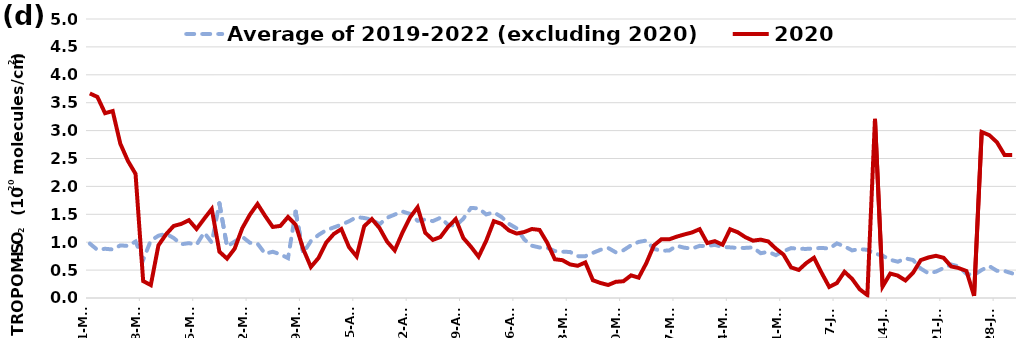
| Category | Average of 2019-2022 (excluding 2020) | 2020 |
|---|---|---|
| 2000-03-01 | 0.975 | 3.666 |
| 2000-03-02 | 0.863 | 3.603 |
| 2000-03-03 | 0.882 | 3.312 |
| 2000-03-04 | 0.87 | 3.35 |
| 2000-03-05 | 0.943 | 2.766 |
| 2000-03-06 | 0.933 | 2.456 |
| 2000-03-07 | 1.012 | 2.224 |
| 2000-03-08 | 0.683 | 0.303 |
| 2000-03-09 | 1.03 | 0.231 |
| 2000-03-10 | 1.116 | 0.943 |
| 2000-03-11 | 1.151 | 1.141 |
| 2000-03-12 | 1.075 | 1.291 |
| 2000-03-13 | 0.963 | 1.328 |
| 2000-03-14 | 0.983 | 1.395 |
| 2000-03-15 | 0.955 | 1.237 |
| 2000-03-16 | 1.172 | 1.42 |
| 2000-03-17 | 0.994 | 1.595 |
| 2000-03-18 | 1.696 | 0.83 |
| 2000-03-19 | 0.924 | 0.706 |
| 2000-03-20 | 1.011 | 0.884 |
| 2000-03-21 | 1.098 | 1.25 |
| 2000-03-22 | 0.99 | 1.493 |
| 2000-03-23 | 0.974 | 1.685 |
| 2000-03-24 | 0.793 | 1.471 |
| 2000-03-25 | 0.829 | 1.273 |
| 2000-03-26 | 0.782 | 1.292 |
| 2000-03-27 | 0.714 | 1.452 |
| 2000-03-28 | 1.547 | 1.313 |
| 2000-03-29 | 0.807 | 0.876 |
| 2000-03-30 | 1.02 | 0.556 |
| 2000-03-31 | 1.13 | 0.717 |
| 2000-04-01 | 1.216 | 0.992 |
| 2000-04-02 | 1.264 | 1.146 |
| 2000-04-03 | 1.313 | 1.235 |
| 2000-04-04 | 1.375 | 0.912 |
| 2000-04-05 | 1.449 | 0.745 |
| 2000-04-06 | 1.434 | 1.287 |
| 2000-04-07 | 1.404 | 1.415 |
| 2000-04-08 | 1.32 | 1.255 |
| 2000-04-09 | 1.439 | 1.01 |
| 2000-04-10 | 1.495 | 0.853 |
| 2000-04-11 | 1.55 | 1.168 |
| 2000-04-12 | 1.507 | 1.443 |
| 2000-04-13 | 1.384 | 1.626 |
| 2000-04-14 | 1.406 | 1.17 |
| 2000-04-15 | 1.378 | 1.041 |
| 2000-04-16 | 1.439 | 1.093 |
| 2000-04-17 | 1.311 | 1.276 |
| 2000-04-18 | 1.294 | 1.414 |
| 2000-04-19 | 1.421 | 1.075 |
| 2000-04-20 | 1.614 | 0.918 |
| 2000-04-21 | 1.607 | 0.74 |
| 2000-04-22 | 1.498 | 1.026 |
| 2000-04-23 | 1.535 | 1.377 |
| 2000-04-24 | 1.453 | 1.328 |
| 2000-04-25 | 1.328 | 1.21 |
| 2000-04-26 | 1.248 | 1.155 |
| 2000-04-27 | 1.049 | 1.183 |
| 2000-04-28 | 0.937 | 1.237 |
| 2000-04-29 | 0.905 | 1.22 |
| 2000-04-30 | 0.899 | 0.992 |
| 2000-05-01 | 0.842 | 0.695 |
| 2000-05-02 | 0.829 | 0.678 |
| 2000-05-03 | 0.825 | 0.602 |
| 2000-05-04 | 0.75 | 0.577 |
| 2000-05-05 | 0.749 | 0.638 |
| 2000-05-06 | 0.808 | 0.318 |
| 2000-05-07 | 0.865 | 0.269 |
| 2000-05-08 | 0.896 | 0.233 |
| 2000-05-09 | 0.819 | 0.29 |
| 2000-05-10 | 0.856 | 0.3 |
| 2000-05-11 | 0.944 | 0.405 |
| 2000-05-12 | 1.005 | 0.365 |
| 2000-05-13 | 1.029 | 0.623 |
| 2000-05-14 | 0.88 | 0.942 |
| 2000-05-15 | 0.848 | 1.055 |
| 2000-05-16 | 0.85 | 1.051 |
| 2000-05-17 | 0.935 | 1.1 |
| 2000-05-18 | 0.901 | 1.139 |
| 2000-05-19 | 0.886 | 1.175 |
| 2000-05-20 | 0.934 | 1.233 |
| 2000-05-21 | 0.932 | 0.984 |
| 2000-05-22 | 0.952 | 1.018 |
| 2000-05-23 | 0.914 | 0.955 |
| 2000-05-24 | 0.907 | 1.232 |
| 2000-05-25 | 0.897 | 1.178 |
| 2000-05-26 | 0.898 | 1.09 |
| 2000-05-27 | 0.906 | 1.027 |
| 2000-05-28 | 0.802 | 1.046 |
| 2000-05-29 | 0.827 | 1.014 |
| 2000-05-30 | 0.768 | 0.884 |
| 2000-05-31 | 0.84 | 0.778 |
| 2000-06-01 | 0.894 | 0.548 |
| 2000-06-02 | 0.881 | 0.503 |
| 2000-06-03 | 0.88 | 0.627 |
| 2000-06-04 | 0.888 | 0.722 |
| 2000-06-05 | 0.898 | 0.45 |
| 2000-06-06 | 0.885 | 0.198 |
| 2000-06-07 | 0.979 | 0.267 |
| 2000-06-08 | 0.926 | 0.47 |
| 2000-06-09 | 0.853 | 0.343 |
| 2000-06-10 | 0.877 | 0.156 |
| 2000-06-11 | 0.863 | 0.052 |
| 2000-06-12 | 0.798 | 3.211 |
| 2000-06-13 | 0.758 | 0.205 |
| 2000-06-14 | 0.685 | 0.436 |
| 2000-06-15 | 0.65 | 0.4 |
| 2000-06-16 | 0.71 | 0.316 |
| 2000-06-17 | 0.681 | 0.454 |
| 2000-06-18 | 0.527 | 0.677 |
| 2000-06-19 | 0.444 | 0.725 |
| 2000-06-20 | 0.472 | 0.756 |
| 2000-06-21 | 0.538 | 0.719 |
| 2000-06-22 | 0.601 | 0.566 |
| 2000-06-23 | 0.565 | 0.536 |
| 2000-06-24 | 0.433 | 0.486 |
| 2000-06-25 | 0.413 | 0.039 |
| 2000-06-26 | 0.502 | 2.977 |
| 2000-06-27 | 0.571 | 2.919 |
| 2000-06-28 | 0.487 | 2.792 |
| 2000-06-29 | 0.483 | 2.564 |
| 2000-06-30 | 0.441 | 2.564 |